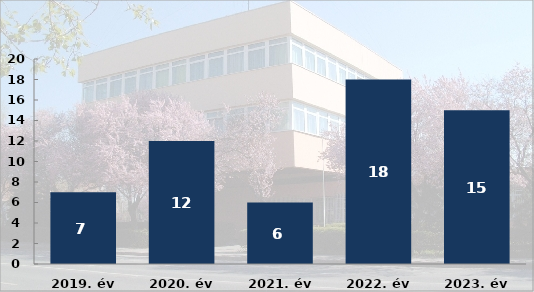
| Category | Tulajdon elleni szabálysértési ügyek száma |
|---|---|
| 2019. év | 7 |
| 2020. év | 12 |
| 2021. év | 6 |
| 2022. év | 18 |
| 2023. év | 15 |